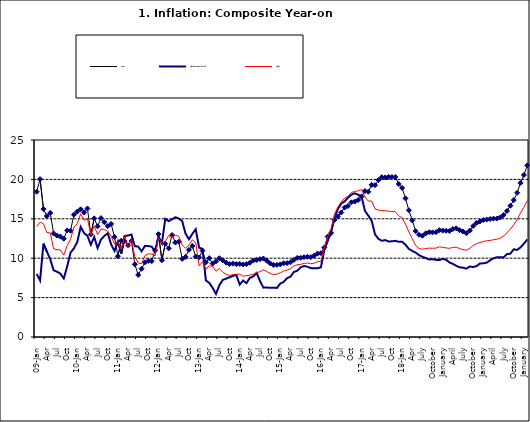
| Category | Food | All Items less Farm Produce | All Items |
|---|---|---|---|
| 09-Jan | 18.436 | 8.013 | 14.034 |
| Feb | 20.041 | 7.178 | 14.584 |
| Mar | 16.233 | 11.842 | 14.366 |
| Apr | 15.342 | 10.85 | 13.268 |
| May | 15.74 | 9.88 | 13.212 |
| June | 13.138 | 8.472 | 11.194 |
| Jul | 12.867 | 8.285 | 11.09 |
| Aug | 12.746 | 8.044 | 11.046 |
| Sep | 12.472 | 7.431 | 10.39 |
| Oct | 13.524 | 8.933 | 11.588 |
| Nov | 13.482 | 10.702 | 12.368 |
| Dec | 15.518 | 11.249 | 13.93 |
| 10-Jan | 15.918 | 12.063 | 14.398 |
| Feb | 16.208 | 13.978 | 15.649 |
| Mar | 15.79 | 13.184 | 14.812 |
| Apr | 16.306 | 12.844 | 15.044 |
| May | 13.023 | 11.711 | 12.915 |
| Jun | 15.053 | 12.686 | 14.099 |
| Jul | 14.043 | 11.287 | 13.002 |
| Aug | 15.09 | 12.366 | 13.702 |
| Sep | 14.57 | 12.83 | 13.65 |
| Oct | 14.065 | 13.168 | 13.45 |
| Nov | 14.351 | 11.746 | 12.766 |
| Dec | 12.701 | 10.917 | 11.815 |
| 11-Jan | 10.255 | 12.118 | 12.08 |
| Feb | 12.221 | 10.569 | 11.1 |
| Mar | 12.169 | 12.815 | 12.779 |
| Apr | 11.629 | 12.882 | 11.291 |
| May | 12.179 | 13.006 | 12.352 |
| Jun | 9.22 | 11.524 | 10.23 |
| Jul | 7.877 | 11.472 | 9.397 |
| Aug | 8.665 | 10.863 | 9.301 |
| Sep | 9.479 | 11.567 | 10.339 |
| Oct | 9.656 | 11.539 | 10.544 |
| Nov | 9.623 | 11.459 | 10.54 |
| Dec | 11.02 | 10.822 | 10.283 |
| 12-Jan | 13.053 | 12.748 | 12.626 |
| 12-Feb | 9.729 | 11.901 | 11.866 |
| 12-Mar | 11.848 | 14.995 | 12.111 |
| Apr | 11.246 | 14.703 | 12.866 |
| May | 12.942 | 14.926 | 12.688 |
| Jun | 11.991 | 15.199 | 12.892 |
| Jul | 12.093 | 15.045 | 12.797 |
| Aug | 9.91 | 14.714 | 11.689 |
| Sep | 10.164 | 13.101 | 11.253 |
| Oct | 11.064 | 12.398 | 11.693 |
| Nov | 11.553 | 13.092 | 12.32 |
| Dec | 10.199 | 13.685 | 11.981 |
| 13-Jan | 10.106 | 11.342 | 9.031 |
| Feb | 10.973 | 11.184 | 9.542 |
| Mar | 9.482 | 7.179 | 8.593 |
| Apr | 10.006 | 6.874 | 9.052 |
| May | 9.321 | 6.227 | 8.964 |
| Jun | 9.606 | 5.472 | 8.353 |
| Jul | 9.994 | 6.58 | 8.682 |
| Aug | 9.723 | 7.245 | 8.231 |
| Sep | 9.437 | 7.41 | 7.952 |
| Oct | 9.249 | 7.579 | 7.807 |
| Nov | 9.313 | 7.75 | 7.931 |
| Dec | 9.253 | 7.872 | 7.957 |
| 14-Jan | 9.271 | 6.648 | 7.977 |
| Feb | 9.207 | 7.166 | 7.707 |
| Mar | 9.254 | 6.836 | 7.783 |
| Apr | 9.414 | 7.508 | 7.851 |
| May | 9.698 | 7.693 | 7.965 |
| Jun | 9.776 | 8.122 | 8.167 |
| Jul | 9.878 | 7.116 | 8.281 |
| Aug | 9.959 | 6.264 | 8.534 |
| Sep | 9.676 | 6.278 | 8.317 |
| Oct | 9.343 | 6.252 | 8.06 |
| Nov | 9.144 | 6.255 | 7.927 |
| Dec | 9.152 | 6.225 | 7.978 |
| 15-Jan | 9.215 | 6.787 | 8.157 |
| Feb | 9.359 | 6.994 | 8.359 |
| Mar | 9.376 | 7.46 | 8.494 |
| Apr | 9.49 | 7.661 | 8.655 |
| May | 9.782 | 8.253 | 9.003 |
| Jun | 10.041 | 8.403 | 9.168 |
| Jul | 10.049 | 8.83 | 9.218 |
| Aug | 10.131 | 9.01 | 9.336 |
| Sep | 10.174 | 8.928 | 9.394 |
| Oct | 10.129 | 8.742 | 9.296 |
| Nov | 10.321 | 8.732 | 9.368 |
| Dec | 10.588 | 8.727 | 9.554 |
| 16-Jan | 10.642 | 8.841 | 9.617 |
| Feb | 11.348 | 11.041 | 11.379 |
| Mar | 12.745 | 12.17 | 12.775 |
| Apr | 13.194 | 13.352 | 13.721 |
| May | 14.861 | 15.054 | 15.577 |
| Jun | 15.302 | 16.224 | 16.48 |
| Jul | 15.799 | 16.929 | 17.127 |
| Aug | 16.427 | 17.208 | 17.609 |
| Sep | 16.622 | 17.666 | 17.852 |
| Oct | 17.09 | 18.067 | 18.33 |
| Nov | 17.191 | 18.241 | 18.476 |
| Dec | 17.388 | 18.052 | 18.547 |
| 17-Jan | 17.818 | 17.867 | 18.719 |
| Feb | 18.528 | 16.011 | 17.78 |
| Mar | 18.436 | 15.404 | 17.256 |
| Apr | 19.303 | 14.75 | 17.244 |
| May | 19.266 | 13.016 | 16.251 |
| Jun | 19.915 | 12.455 | 16.098 |
| Jul | 20.284 | 12.207 | 16.053 |
| Aug | 20.251 | 12.296 | 16.012 |
| Sep | 20.321 | 12.123 | 15.979 |
| Oct | 20.306 | 12.142 | 15.905 |
| Nov | 20.308 | 12.206 | 15.901 |
| Dec | 19.415 | 12.089 | 15.372 |
| 18-Jan | 18.919 | 12.09 | 15.127 |
| Feb | 17.588 | 11.707 | 14.33 |
| Mar | 16.08 | 11.181 | 13.337 |
| Apr | 14.799 | 10.92 | 12.482 |
| May | 13.448 | 10.71 | 11.608 |
| June | 12.977 | 10.387 | 11.231 |
| July | 12.85 | 10.183 | 11.142 |
| August | 13.158 | 10.015 | 11.227 |
| September | 13.309 | 9.838 | 11.284 |
| October | 13.277 | 9.882 | 11.259 |
| November | 13.301 | 9.787 | 11.281 |
| December | 13.559 | 9.771 | 11.442 |
| January | 13.505 | 9.91 | 11.374 |
| February | 13.473 | 9.8 | 11.306 |
| March | 13.451 | 9.461 | 11.251 |
| April | 13.701 | 9.28 | 11.372 |
| May | 13.794 | 9.033 | 11.396 |
| June | 13.558 | 8.841 | 11.217 |
| July | 13.392 | 8.798 | 11.084 |
| August | 13.17 | 8.678 | 11.016 |
| September | 13.507 | 8.945 | 11.244 |
| October | 14.088 | 8.876 | 11.607 |
| November | 14.482 | 8.993 | 11.854 |
| December | 14.667 | 9.331 | 11.982 |
| January | 14.849 | 9.349 | 12.132 |
| February | 14.904 | 9.434 | 12.199 |
| March | 14.977 | 9.732 | 12.257 |
| April | 15.026 | 9.979 | 12.341 |
| May | 15.036 | 10.12 | 12.404 |
| June | 15.175 | 10.128 | 12.559 |
| July | 15.482 | 10.102 | 12.821 |
| August | 15.996 | 10.521 | 13.22 |
| September | 16.66 | 10.581 | 13.707 |
| October | 17.378 | 11.137 | 14.233 |
| November | 18.298 | 11.05 | 14.887 |
| December | 19.562 | 11.374 | 15.753 |
| January | 20.567 | 11.854 | 16.466 |
| February | 21.786 | 12.382 | 17.335 |